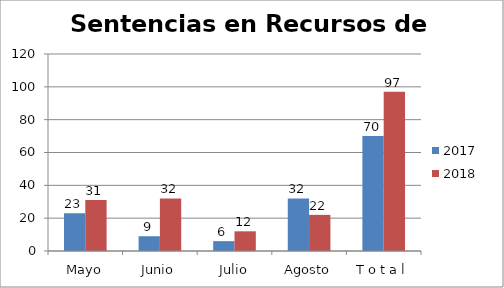
| Category | 2017 | 2018 |
|---|---|---|
| Mayo | 23 | 31 |
| Junio | 9 | 32 |
| Julio | 6 | 12 |
| Agosto | 32 | 22 |
| T o t a l | 70 | 97 |